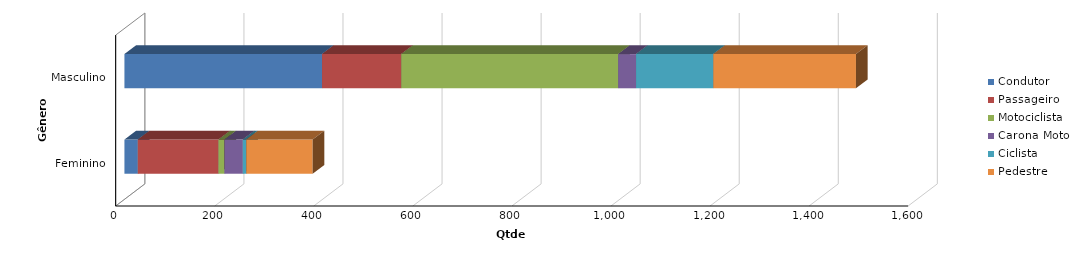
| Category | Condutor | Passageiro | Motociclista | Carona Moto | Ciclista | Pedestre |
|---|---|---|---|---|---|---|
| Feminino | 27 | 163 | 12 | 37 | 7 | 134 |
| Masculino | 399 | 160 | 438 | 36 | 156 | 288 |